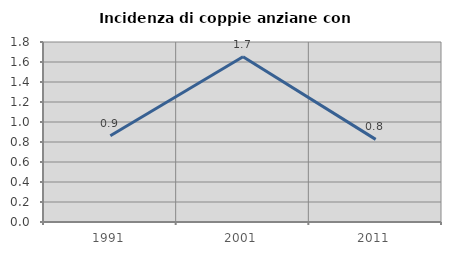
| Category | Incidenza di coppie anziane con figli |
|---|---|
| 1991.0 | 0.862 |
| 2001.0 | 1.653 |
| 2011.0 | 0.826 |